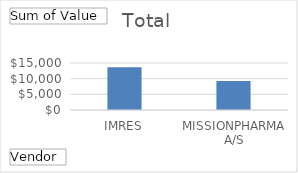
| Category | Total |
|---|---|
| IMRES | 13627.2 |
| MISSIONPHARMA A/S | 9225.6 |